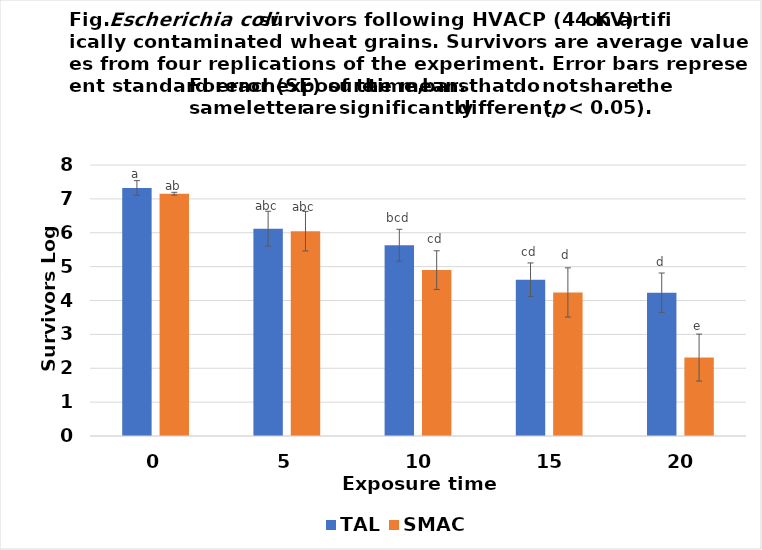
| Category | TAL | SMAC |
|---|---|---|
| 0.0 | 7.322 | 7.152 |
| 5.0 | 6.12 | 6.048 |
| 10.0 | 5.63 | 4.898 |
| 15.0 | 4.615 | 4.238 |
| 20.0 | 4.23 | 2.315 |